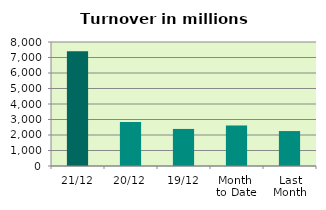
| Category | Series 0 |
|---|---|
| 21/12 | 7400.136 |
| 20/12 | 2841.724 |
| 19/12 | 2391.834 |
| Month 
to Date | 2614.777 |
| Last
Month | 2254.707 |